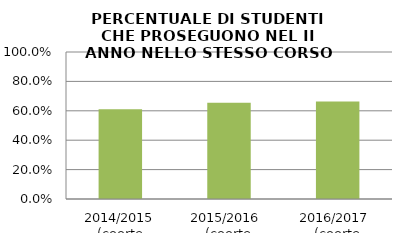
| Category | 2014/2015 (coorte 2013/14) 2015/2016  (coorte 2014/15) 2016/2017  (coorte 2015/16) |
|---|---|
| 2014/2015 (coorte 2013/14) | 0.61 |
| 2015/2016  (coorte 2014/15) | 0.655 |
| 2016/2017  (coorte 2015/16) | 0.664 |